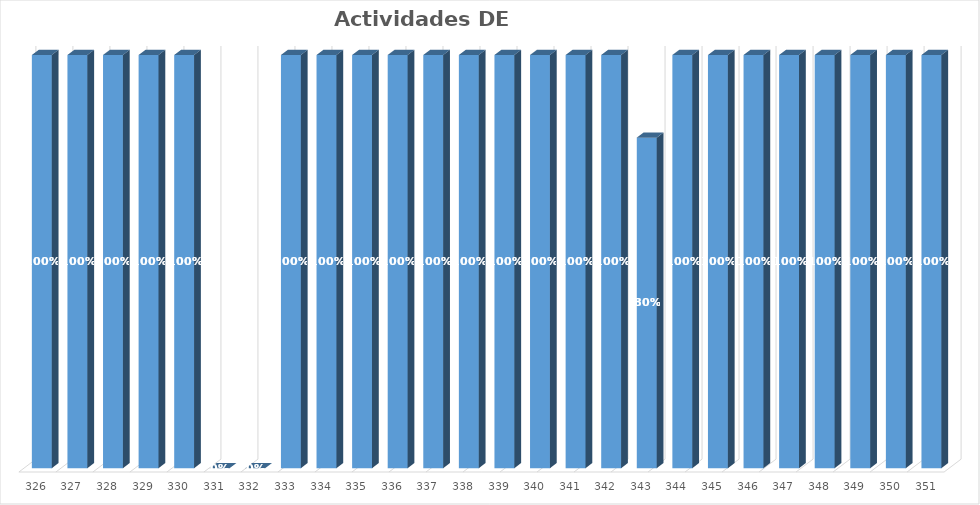
| Category | % Avance |
|---|---|
| 326.0 | 1 |
| 327.0 | 1 |
| 328.0 | 1 |
| 329.0 | 1 |
| 330.0 | 1 |
| 331.0 | 0 |
| 332.0 | 0 |
| 333.0 | 1 |
| 334.0 | 1 |
| 335.0 | 1 |
| 336.0 | 1 |
| 337.0 | 1 |
| 338.0 | 1 |
| 339.0 | 1 |
| 340.0 | 1 |
| 341.0 | 1 |
| 342.0 | 1 |
| 343.0 | 0.8 |
| 344.0 | 1 |
| 345.0 | 1 |
| 346.0 | 1 |
| 347.0 | 1 |
| 348.0 | 1 |
| 349.0 | 1 |
| 350.0 | 1 |
| 351.0 | 1 |